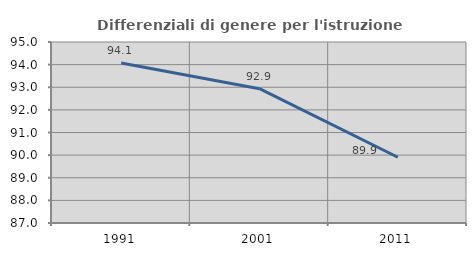
| Category | Differenziali di genere per l'istruzione superiore |
|---|---|
| 1991.0 | 94.07 |
| 2001.0 | 92.938 |
| 2011.0 | 89.907 |